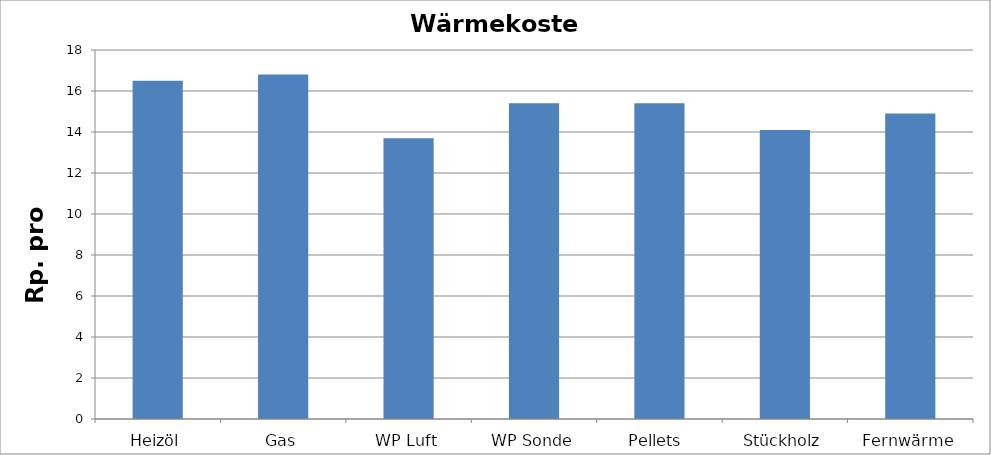
| Category | Wärmekosten [Rp./kWh] |
|---|---|
| Heizöl | 16.5 |
| Gas | 16.8 |
| WP Luft | 13.7 |
| WP Sonde | 15.4 |
| Pellets  | 15.4 |
| Stückholz | 14.1 |
| Fernwärme | 14.9 |